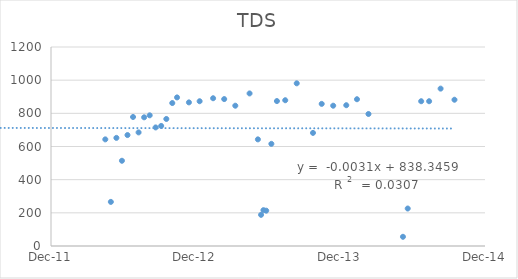
| Category | Series 0 |
|---|---|
| 41017.0 | 643 |
| 41031.0 | 266 |
| 41045.0 | 652 |
| 41059.0 | 514 |
| 41073.0 | 669 |
| 41087.0 | 778 |
| 41101.0 | 685 |
| 41115.0 | 776 |
| 41129.0 | 788 |
| 41144.0 | 715 |
| 41158.0 | 724 |
| 41171.0 | 766 |
| 41186.0 | 862 |
| 41198.0 | 896 |
| 41228.0 | 866 |
| 41255.0 | 873 |
| 41289.0 | 891 |
| 41317.0 | 886 |
| 41345.0 | 846 |
| 41381.0 | 920 |
| 41402.0 | 643 |
| 41410.0 | 188 |
| 41416.0 | 216 |
| 41423.0 | 213 |
| 41436.0 | 616 |
| 41450.0 | 874 |
| 41471.0 | 879 |
| 41500.0 | 981 |
| 41541.0 | 682 |
| 41563.0 | 857 |
| 41592.0 | 846 |
| 41625.0 | 849 |
| 41652.0 | 885 |
| 41681.0 | 796 |
| 41768.0 | 55.5 |
| 41780.0 | 226 |
| 41814.0 | 873 |
| 41834.0 | 873 |
| 41863.0 | 949 |
| 41898.0 | 882 |